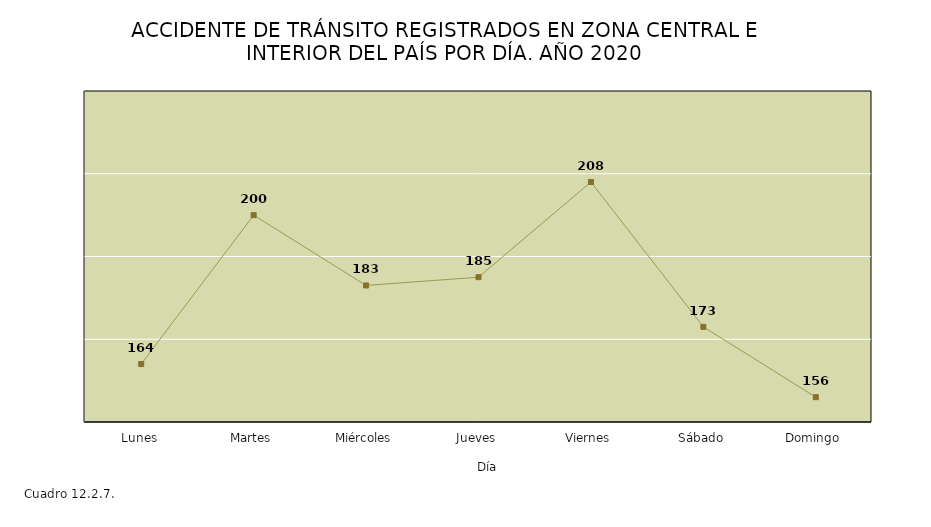
| Category | Series 0 |
|---|---|
| Lunes | 164 |
| Martes | 200 |
| Miércoles | 183 |
| Jueves | 185 |
| Viernes | 208 |
| Sábado | 173 |
| Domingo | 156 |